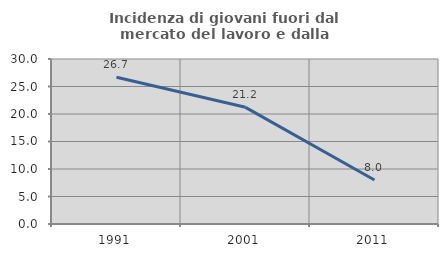
| Category | Incidenza di giovani fuori dal mercato del lavoro e dalla formazione  |
|---|---|
| 1991.0 | 26.667 |
| 2001.0 | 21.212 |
| 2011.0 | 8 |